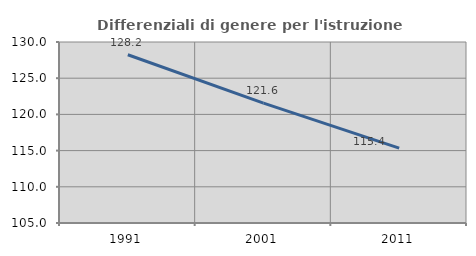
| Category | Differenziali di genere per l'istruzione superiore |
|---|---|
| 1991.0 | 128.24 |
| 2001.0 | 121.564 |
| 2011.0 | 115.352 |